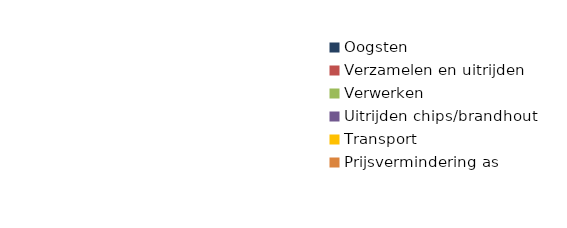
| Category | Grafieken kostenverhouding: |
|---|---|
| Oogsten | 0 |
| Verzamelen en uitrijden | 0 |
| Verwerken | 0 |
| Uitrijden chips/brandhout | 0 |
| Transport | 0 |
| Prijsvermindering as | 0 |